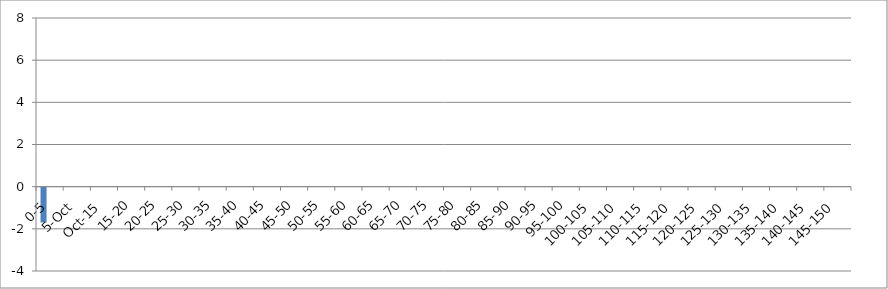
| Category | 12 UNION_ALL | 12 INTERSECTION_ALL | 12 UNION(INTERSECTION_119875_146067,INTERSECTION_119875_241240,INTERSECTION_146067_241240) |
|---|---|---|---|
| 0-5 | -1.651 | 0 | 0 |
| 5-Oct | 0 | 0 | 0 |
| Oct-15 | 0 | 0 | 0 |
| 15-20 | 0 | 0 | 0 |
| 20-25 | 0 | 0 | 0 |
| 25-30 | 0 | 0 | 0 |
| 30-35 | 0 | 0 | 0 |
| 35-40 | 0 | 0 | 0 |
| 40-45 | 0 | 0 | 0 |
| 45-50 | 0 | 0 | 0 |
| 50-55 | 0 | 0 | 0 |
| 55-60 | 0 | 0 | 0 |
| 60-65 | 0 | 0 | 0 |
| 65-70 | 0 | 0 | 0 |
| 70-75 | 0 | 0 | 0 |
| 75-80 | 0 | 0 | 0 |
| 80-85 | 0 | 0 | 0 |
| 85-90 | 0 | 0 | 0 |
| 90-95 | 0 | 0 | 0 |
| 95-100 | 0 | 0 | 0 |
| 100-105 | 0 | 0 | 0 |
| 105-110 | 0 | 0 | 0 |
| 110-115 | 0 | 0 | 0 |
| 115-120 | 0 | 0 | 0 |
| 120-125 | 0 | 0 | 0 |
| 125-130 | 0 | 0 | 0 |
| 130-135 | 0 | 0 | 0 |
| 135-140 | 0 | 0 | 0 |
| 140-145 | 0 | 0 | 0 |
| 145-150 | 0 | 0 | 0 |